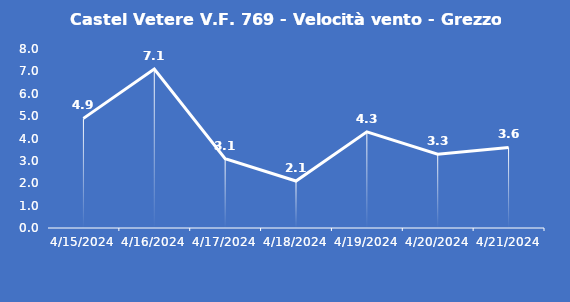
| Category | Castel Vetere V.F. 769 - Velocità vento - Grezzo (m/s) |
|---|---|
| 4/15/24 | 4.9 |
| 4/16/24 | 7.1 |
| 4/17/24 | 3.1 |
| 4/18/24 | 2.1 |
| 4/19/24 | 4.3 |
| 4/20/24 | 3.3 |
| 4/21/24 | 3.6 |